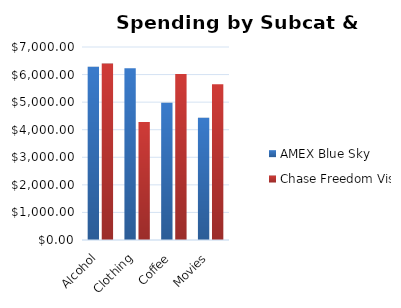
| Category | AMEX Blue Sky | Chase Freedom Visa |
|---|---|---|
| Alcohol | 6286.442 | 6397.495 |
| Clothing | 6225.473 | 4283.142 |
| Coffee | 4976.676 | 6020.788 |
| Movies | 4437.745 | 5647.346 |